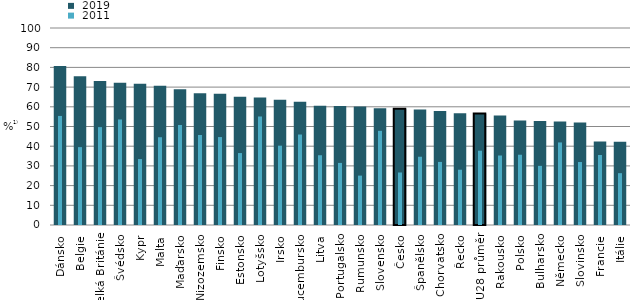
| Category |  2019 |
|---|---|
| Dánsko | 80.763 |
| Belgie | 75.526 |
| Velká Británie | 73.126 |
| Švédsko | 72.221 |
| Kypr | 71.716 |
| Malta | 70.661 |
| Maďarsko | 68.857 |
| Nizozemsko | 66.905 |
| Finsko | 66.681 |
| Estonsko | 65.138 |
| Lotyšsko | 64.662 |
| Irsko | 63.577 |
| Lucembursko | 62.511 |
| Litva | 60.571 |
| Portugalsko | 60.401 |
| Rumunsko | 60.176 |
| Slovensko | 59.245 |
| Česko | 58.95 |
| Španělsko | 58.608 |
| Chorvatsko | 57.879 |
| Řecko | 56.693 |
| EU28 průměr | 56.567 |
| Rakousko | 55.555 |
| Polsko | 53.039 |
| Bulharsko | 52.853 |
| Německo | 52.503 |
| Slovinsko | 52.085 |
| Francie | 42.324 |
| Itálie | 42.295 |